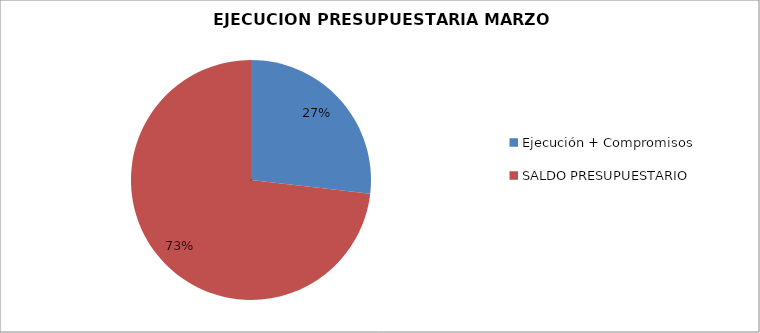
| Category | Series 0 |
|---|---|
| Ejecución + Compromisos | 18400167065 |
| SALDO PRESUPUESTARIO | 50191936496 |